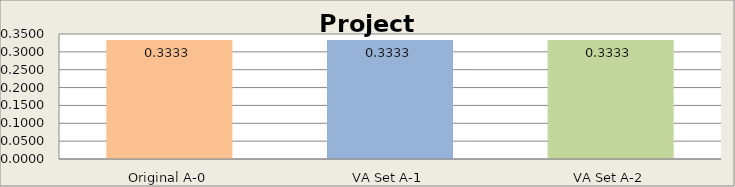
| Category | Risk Module |
|---|---|
| Original A-0 | 0.333 |
| VA Set A-1 | 0.333 |
| VA Set A-2 | 0.333 |